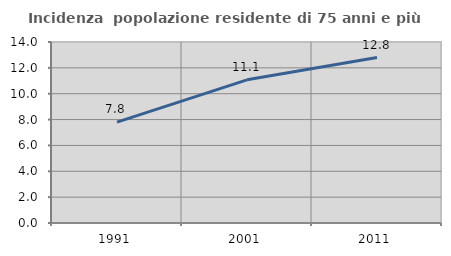
| Category | Incidenza  popolazione residente di 75 anni e più |
|---|---|
| 1991.0 | 7.806 |
| 2001.0 | 11.073 |
| 2011.0 | 12.795 |